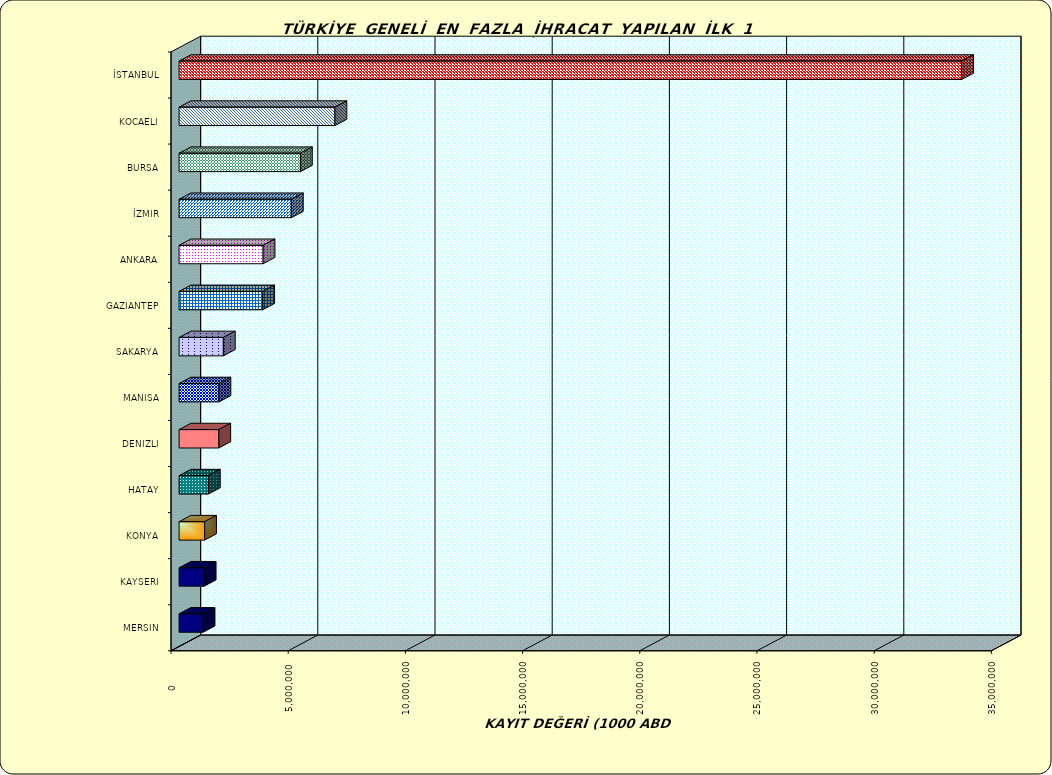
| Category | Series 0 |
|---|---|
| İSTANBUL | 33389309.601 |
| KOCAELI | 6650051.13 |
| BURSA | 5178716.399 |
| İZMIR | 4792041.134 |
| ANKARA | 3584966.989 |
| GAZIANTEP | 3568154.592 |
| SAKARYA | 1889533.566 |
| MANISA | 1702328.363 |
| DENIZLI | 1695595.823 |
| HATAY | 1251728.167 |
| KONYA | 1090075.993 |
| KAYSERI | 1073032.364 |
| MERSIN | 1024845.299 |